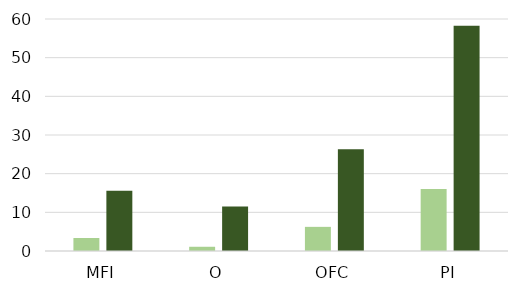
| Category | 2018 | 2022 |
|---|---|---|
| MFI | 3.356 | 15.609 |
| O | 1.095 | 11.537 |
| OFC | 6.243 | 26.318 |
| PI | 16.039 | 58.251 |